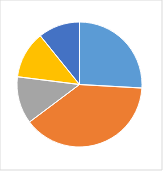
| Category | Series 0 |
|---|---|
| 0 | 0.261 |
| 1 | 0.391 |
| 2 | 0.123 |
| 3 | 0.123 |
| 4 | 0.109 |